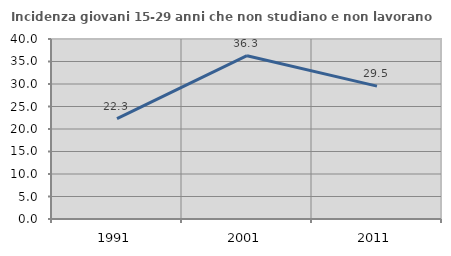
| Category | Incidenza giovani 15-29 anni che non studiano e non lavorano  |
|---|---|
| 1991.0 | 22.292 |
| 2001.0 | 36.289 |
| 2011.0 | 29.524 |